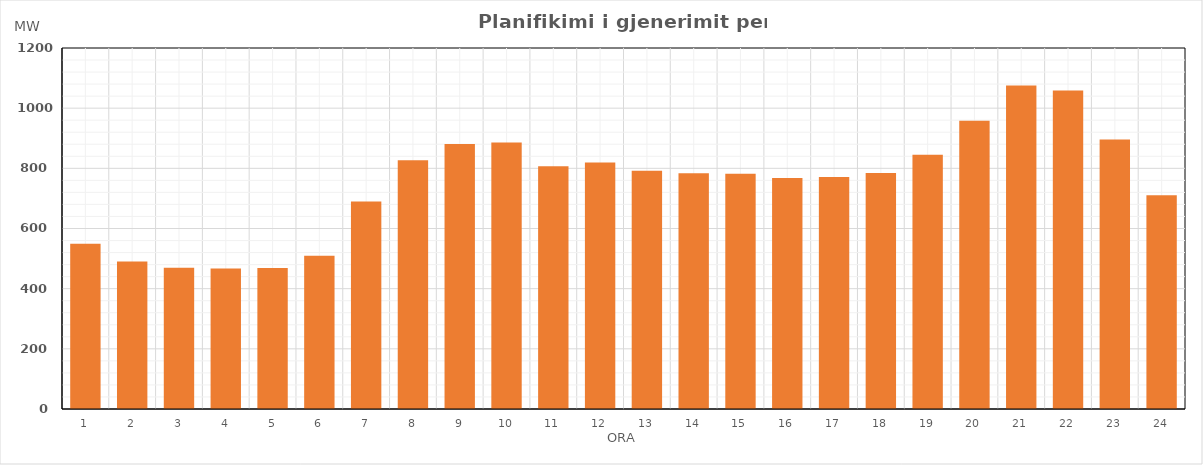
| Category | Max (MW) |
|---|---|
| 0 | 549.56 |
| 1 | 490.28 |
| 2 | 469.56 |
| 3 | 466.86 |
| 4 | 468.97 |
| 5 | 509.74 |
| 6 | 690.15 |
| 7 | 827.09 |
| 8 | 881.29 |
| 9 | 886.23 |
| 10 | 807.02 |
| 11 | 819.69 |
| 12 | 792.09 |
| 13 | 783.28 |
| 14 | 781.96 |
| 15 | 768.27 |
| 16 | 770.83 |
| 17 | 784.72 |
| 18 | 844.97 |
| 19 | 958.58 |
| 20 | 1075.22 |
| 21 | 1058.47 |
| 22 | 895.77 |
| 23 | 710.47 |